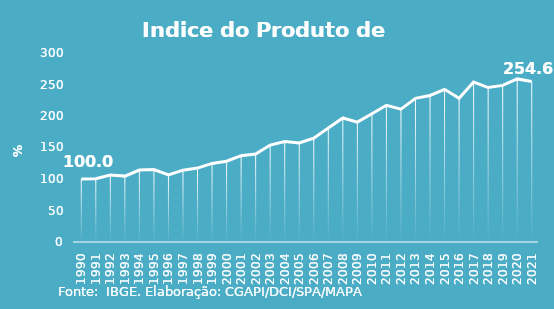
| Category | Indice de Prod. base 1990 |
|---|---|
| 1990.0 | 100 |
| 1991.0 | 100.275 |
| 1992.0 | 106.203 |
| 1993.0 | 104.57 |
| 1994.0 | 114.164 |
| 1995.0 | 115.024 |
| 1996.0 | 106.552 |
| 1997.0 | 114.037 |
| 1998.0 | 117.319 |
| 1999.0 | 124.734 |
| 2000.0 | 128.293 |
| 2001.0 | 136.975 |
| 2002.0 | 139.51 |
| 2003.0 | 153.868 |
| 2004.0 | 159.641 |
| 2005.0 | 157.136 |
| 2006.0 | 164.858 |
| 2007.0 | 180.781 |
| 2008.0 | 196.91 |
| 2009.0 | 190.309 |
| 2010.0 | 203.581 |
| 2011.0 | 217.041 |
| 2012.0 | 210.932 |
| 2013.0 | 228.009 |
| 2014.0 | 232.562 |
| 2015.0 | 242.318 |
| 2016.0 | 228.239 |
| 2017.0 | 253.826 |
| 2018.0 | 245.134 |
| 2019.0 | 248.619 |
| 2020.0 | 258.848 |
| 2021.0 | 254.647 |